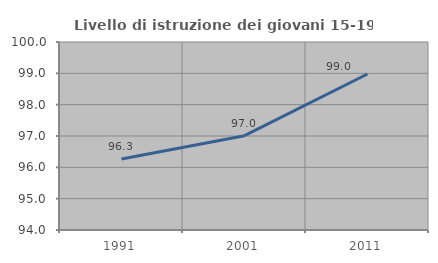
| Category | Livello di istruzione dei giovani 15-19 anni |
|---|---|
| 1991.0 | 96.264 |
| 2001.0 | 97.01 |
| 2011.0 | 98.98 |